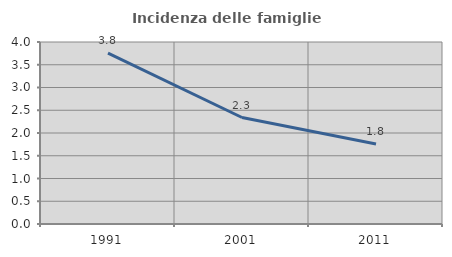
| Category | Incidenza delle famiglie numerose |
|---|---|
| 1991.0 | 3.757 |
| 2001.0 | 2.34 |
| 2011.0 | 1.759 |